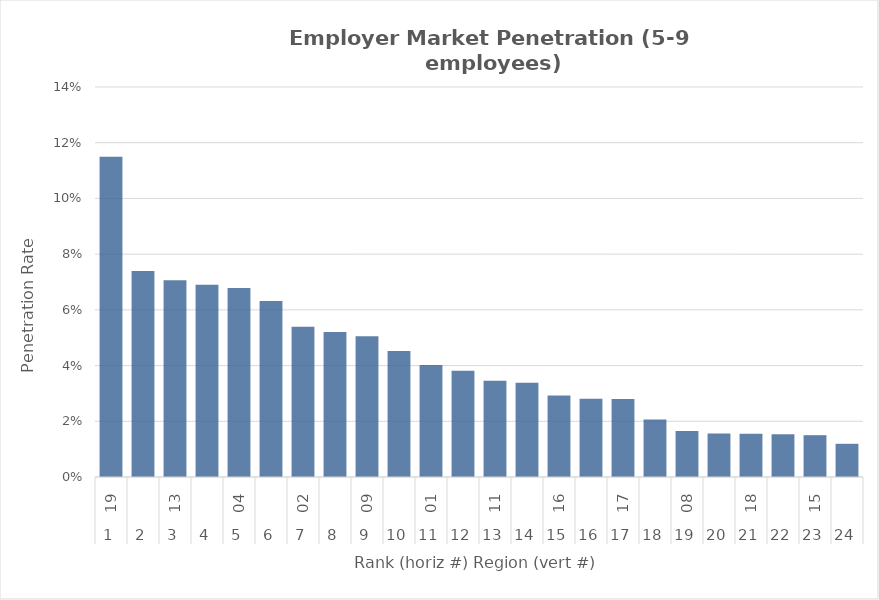
| Category | Rate |
|---|---|
| 0 | 0.115 |
| 1 | 0.074 |
| 2 | 0.071 |
| 3 | 0.069 |
| 4 | 0.068 |
| 5 | 0.063 |
| 6 | 0.054 |
| 7 | 0.052 |
| 8 | 0.051 |
| 9 | 0.045 |
| 10 | 0.04 |
| 11 | 0.038 |
| 12 | 0.035 |
| 13 | 0.034 |
| 14 | 0.029 |
| 15 | 0.028 |
| 16 | 0.028 |
| 17 | 0.021 |
| 18 | 0.016 |
| 19 | 0.016 |
| 20 | 0.015 |
| 21 | 0.015 |
| 22 | 0.015 |
| 23 | 0.012 |